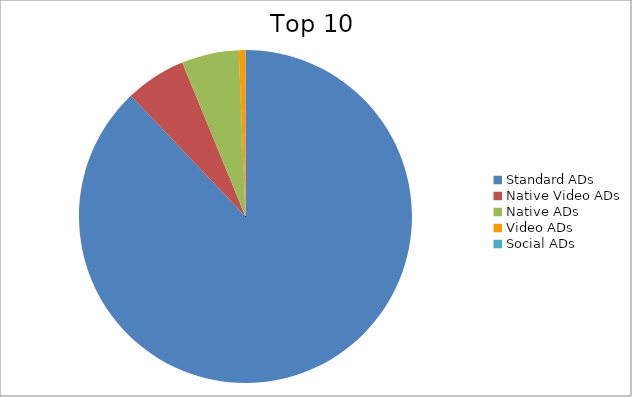
| Category | Series 0 |
|---|---|
| Standard ADs | 87.91 |
| Native Video ADs | 5.9 |
| Native ADs | 5.55 |
| Video ADs | 0.64 |
| Social ADs | 0.01 |